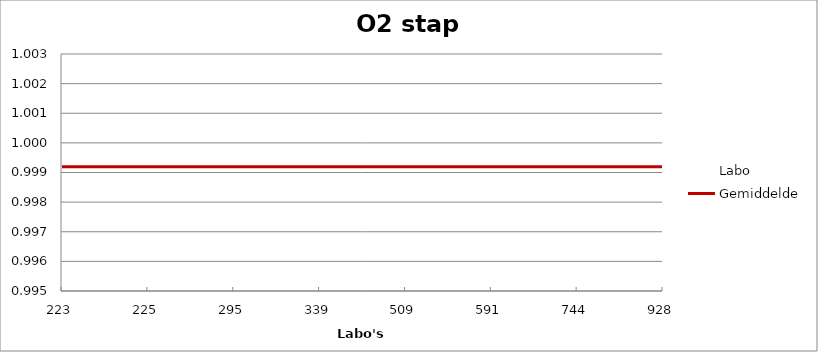
| Category | Labo | Gemiddelde |
|---|---|---|
| 223.0 | 1 | 0.999 |
| 225.0 | 1.001 | 0.999 |
| 295.0 | 1 | 0.999 |
| 339.0 | 1.001 | 0.999 |
| 509.0 | 0.997 | 0.999 |
| 591.0 | 1 | 0.999 |
| 744.0 | 0.997 | 0.999 |
| 928.0 | 0.996 | 0.999 |